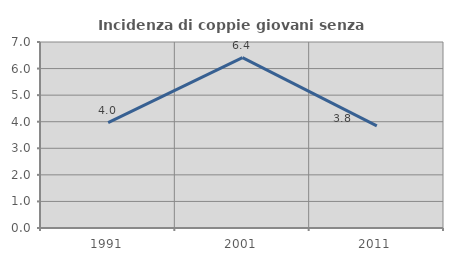
| Category | Incidenza di coppie giovani senza figli |
|---|---|
| 1991.0 | 3.965 |
| 2001.0 | 6.41 |
| 2011.0 | 3.846 |